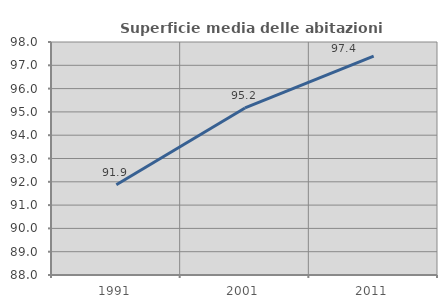
| Category | Superficie media delle abitazioni occupate |
|---|---|
| 1991.0 | 91.871 |
| 2001.0 | 95.17 |
| 2011.0 | 97.39 |